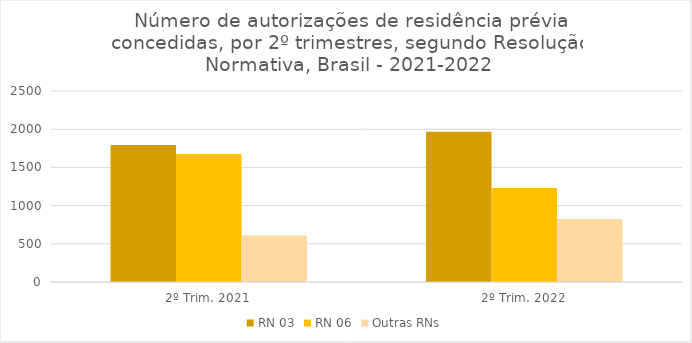
| Category | RN 03 | RN 06 | Outras RNs |
|---|---|---|---|
| 2º Trim. 2021 | 1792 | 1676 | 608 |
| 2º Trim. 2022 | 1965 | 1231 | 823 |